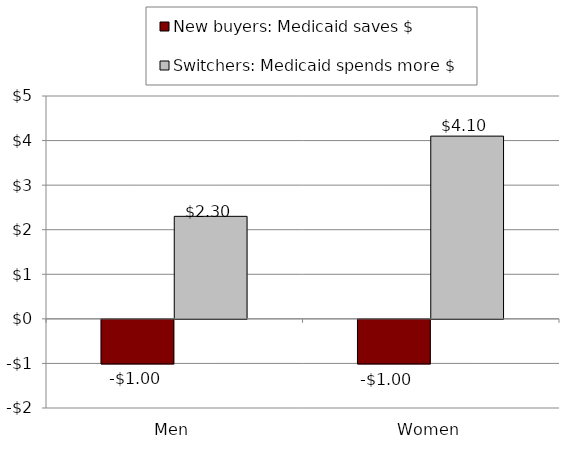
| Category | New buyers: Medicaid saves $ | Switchers: Medicaid spends more $ |
|---|---|---|
| Men | -1 | 2.3 |
| Women | -1 | 4.1 |